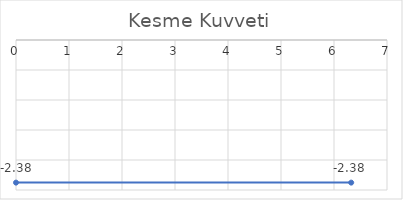
| Category | Series 0 |
|---|---|
| 0.0 | -2.377 |
| 6.324555320336759 | -2.377 |